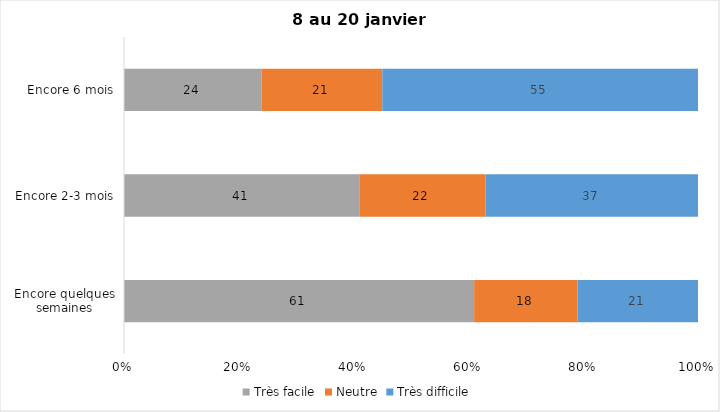
| Category | Très facile | Neutre | Très difficile |
|---|---|---|---|
| Encore quelques semaines | 61 | 18 | 21 |
| Encore 2-3 mois | 41 | 22 | 37 |
| Encore 6 mois | 24 | 21 | 55 |